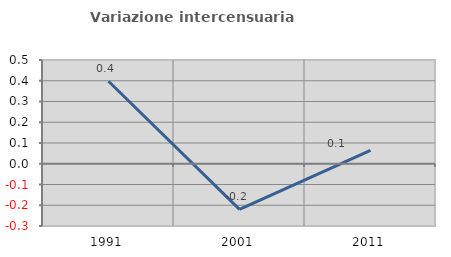
| Category | Variazione intercensuaria annua |
|---|---|
| 1991.0 | 0.397 |
| 2001.0 | -0.22 |
| 2011.0 | 0.064 |